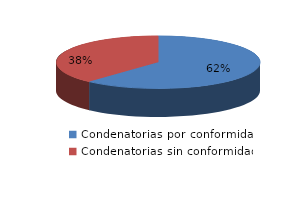
| Category | Series 0 |
|---|---|
| 0 | 50 |
| 1 | 31 |